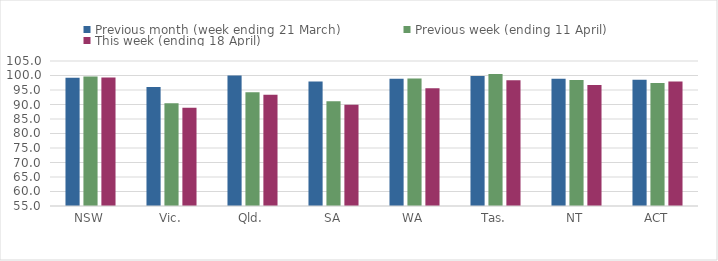
| Category | Previous month (week ending 21 March) | Previous week (ending 11 April) | This week (ending 18 April) |
|---|---|---|---|
| NSW | 99.229 | 99.622 | 99.275 |
| Vic. | 96.002 | 90.398 | 88.878 |
| Qld. | 100 | 94.235 | 93.365 |
| SA | 97.92 | 91.139 | 89.918 |
| WA | 98.838 | 98.928 | 95.567 |
| Tas. | 99.793 | 100.542 | 98.402 |
| NT | 98.839 | 98.415 | 96.752 |
| ACT | 98.544 | 97.415 | 97.902 |